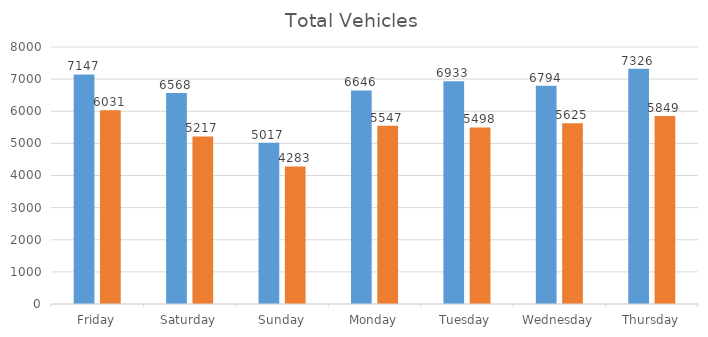
| Category | South Bound | North Bound |
|---|---|---|
| Friday | 7147 | 6031 |
| Saturday | 6568 | 5217 |
| Sunday | 5017 | 4283 |
| Monday | 6646 | 5547 |
| Tuesday | 6933 | 5498 |
| Wednesday | 6794 | 5625 |
| Thursday | 7326 | 5849 |